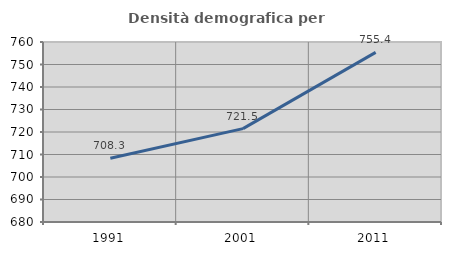
| Category | Densità demografica |
|---|---|
| 1991.0 | 708.35 |
| 2001.0 | 721.487 |
| 2011.0 | 755.4 |